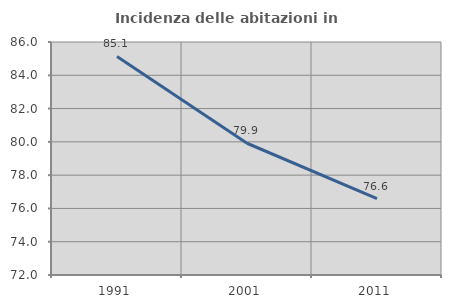
| Category | Incidenza delle abitazioni in proprietà  |
|---|---|
| 1991.0 | 85.13 |
| 2001.0 | 79.916 |
| 2011.0 | 76.596 |